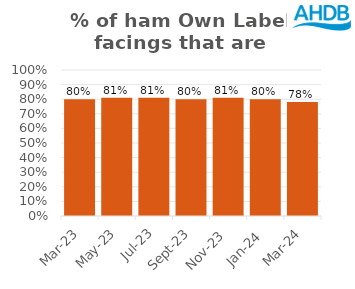
| Category | Ham |
|---|---|
| 2023-03-01 | 0.8 |
| 2023-05-01 | 0.81 |
| 2023-07-01 | 0.81 |
| 2023-09-01 | 0.8 |
| 2023-11-01 | 0.81 |
| 2024-01-01 | 0.8 |
| 2024-03-01 | 0.78 |